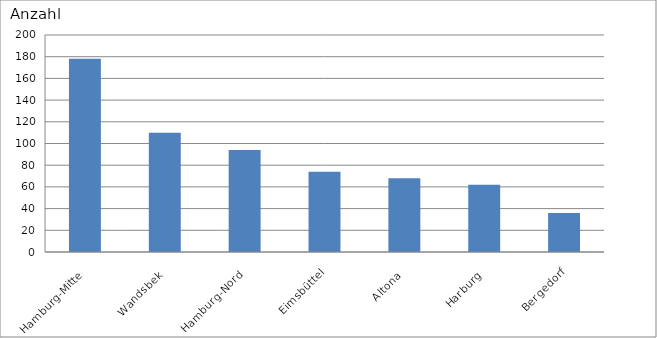
| Category | Hamburg-Mitte |
|---|---|
| Hamburg-Mitte | 178 |
| Wandsbek | 110 |
| Hamburg-Nord | 94 |
| Eimsbüttel | 74 |
| Altona | 68 |
| Harburg | 62 |
| Bergedorf | 36 |